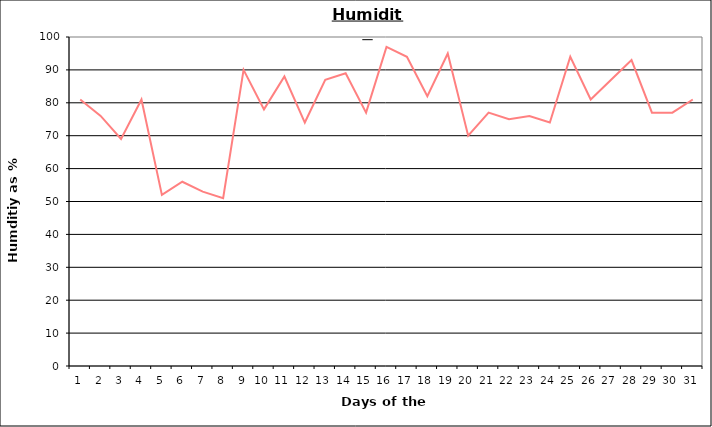
| Category | Series 0 |
|---|---|
| 0 | 81 |
| 1 | 76 |
| 2 | 69 |
| 3 | 81 |
| 4 | 52 |
| 5 | 56 |
| 6 | 53 |
| 7 | 51 |
| 8 | 90 |
| 9 | 78 |
| 10 | 88 |
| 11 | 74 |
| 12 | 87 |
| 13 | 89 |
| 14 | 77 |
| 15 | 97 |
| 16 | 94 |
| 17 | 82 |
| 18 | 95 |
| 19 | 70 |
| 20 | 77 |
| 21 | 75 |
| 22 | 76 |
| 23 | 74 |
| 24 | 94 |
| 25 | 81 |
| 26 | 87 |
| 27 | 93 |
| 28 | 77 |
| 29 | 77 |
| 30 | 81 |